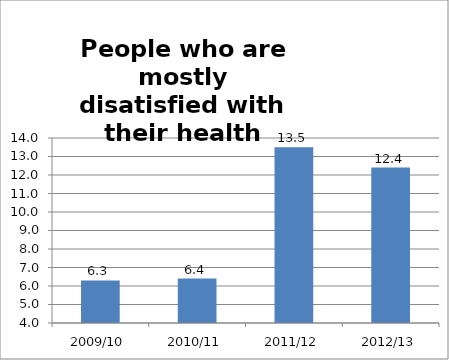
| Category | Series 0 |
|---|---|
| 2009/10 | 6.3 |
| 2010/11 | 6.4 |
| 2011/12 | 13.5 |
| 2012/13 | 12.4 |